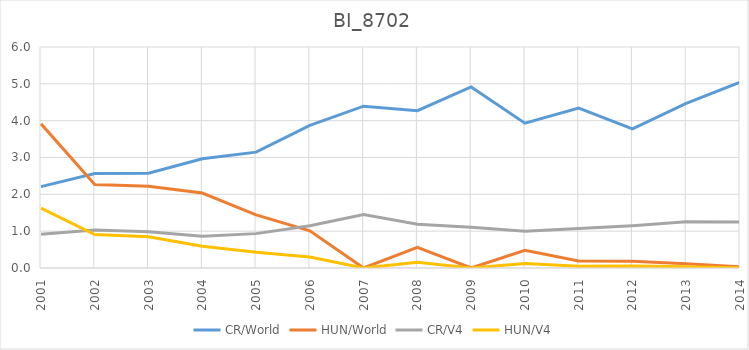
| Category | CR/World | HUN/World | CR/V4 | HUN/V4 |
|---|---|---|---|---|
| 2001.0 | 2.21 | 3.916 | 0.916 | 1.623 |
| 2002.0 | 2.566 | 2.265 | 1.029 | 0.908 |
| 2003.0 | 2.572 | 2.218 | 0.987 | 0.851 |
| 2004.0 | 2.967 | 2.035 | 0.86 | 0.59 |
| 2005.0 | 3.145 | 1.444 | 0.933 | 0.428 |
| 2006.0 | 3.872 | 1.011 | 1.145 | 0.299 |
| 2007.0 | 4.394 | 0 | 1.452 | 0 |
| 2008.0 | 4.271 | 0.56 | 1.187 | 0.156 |
| 2009.0 | 4.916 | 0 | 1.103 | 0 |
| 2010.0 | 3.932 | 0.478 | 0.998 | 0.121 |
| 2011.0 | 4.344 | 0.189 | 1.071 | 0.047 |
| 2012.0 | 3.774 | 0.183 | 1.15 | 0.056 |
| 2013.0 | 4.471 | 0.114 | 1.258 | 0.032 |
| 2014.0 | 5.045 | 0.031 | 1.246 | 0.008 |